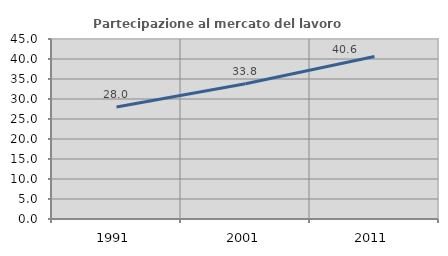
| Category | Partecipazione al mercato del lavoro  femminile |
|---|---|
| 1991.0 | 28.006 |
| 2001.0 | 33.824 |
| 2011.0 | 40.604 |